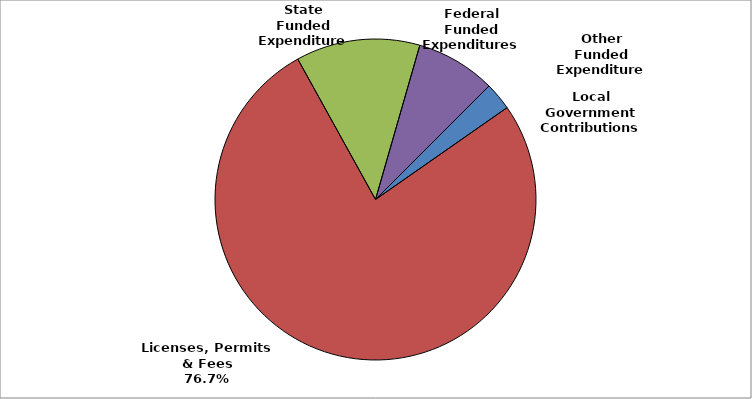
| Category | Series 0 |
|---|---|
| Local Government Contributions | 0.028 |
| Licenses, Permits & Fees | 0.767 |
| State Funded Expenditures | 0.125 |
| Federal Funded Expenditures | 0.08 |
| Other Funded Expenditures | 0 |